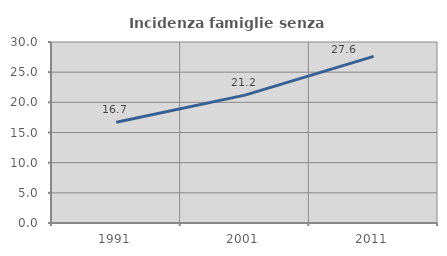
| Category | Incidenza famiglie senza nuclei |
|---|---|
| 1991.0 | 16.697 |
| 2001.0 | 21.2 |
| 2011.0 | 27.613 |